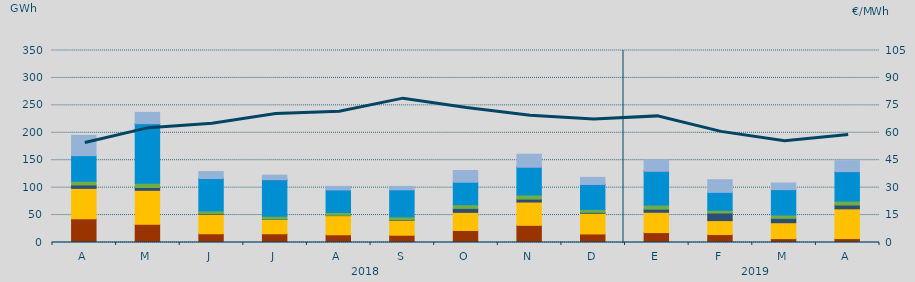
| Category | Carbón | Ciclo Combinado | Cogeneración | Consumo Bombeo | Eólica | Hidráulica | Nuclear | Otras Renovables | Turbinación bombeo |
|---|---|---|---|---|---|---|---|---|---|
| A | 43196.7 | 55522.2 | 0 | 6134.1 | 6758.4 | 46798.3 | 0 | 0 | 36861.2 |
| M | 33193.7 | 61920.1 | 0 | 5137.4 | 7808.1 | 108282.8 | 306.6 | 16.5 | 20554.6 |
| J | 15935.3 | 35519.8 | 0 | 1509.9 | 4554.3 | 58954.4 | 75 | 0 | 12771.1 |
| J | 15870.8 | 26056.8 | 0 | 559.4 | 5548.3 | 66078.1 | 193.3 | 0 | 8452.7 |
| A | 14111.4 | 34857 | 0 | 481.3 | 5182.6 | 41241.9 | 0 | 0 | 6495.2 |
| S | 13245.9 | 27321.2 | 0 | 906.1 | 5246.7 | 49548.9 | 0 | 4 | 6015.5 |
| O | 21827.2 | 33089.3 | 0 | 7219.1 | 6754.8 | 41404 | 0 | 2.5 | 21004.3 |
| N | 31318.1 | 42466.7 | 0 | 5322 | 7477 | 50882.1 | 34.4 | 69.8 | 23397.6 |
| D | 15554.9 | 37706.5 | 0 | 1783.4 | 5010 | 45893.5 | 75.9 | 3.2 | 12660 |
| E | 18038.9 | 37091.8 | 0 | 5584.1 | 7459.5 | 61806.6 | 125.1 | 3.8 | 20506.3 |
| F | 14436.3 | 25499.5 | 0 | 13820.1 | 4854.6 | 33013.5 | 0 | 95.8 | 22781.5 |
| M | 7069 | 28989.6 | 0 | 7976 | 6086 | 46385.5 | 0 | 4 | 12004.9 |
| A | 7133.3 | 54294.6 | 0 | 6877.3 | 7238.7 | 53741.4 | 18.8 | 1.7 | 19863.3 |